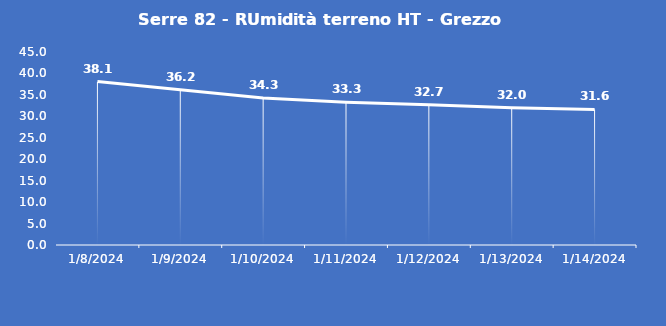
| Category | Serre 82 - RUmidità terreno HT - Grezzo (%VWC) |
|---|---|
| 1/8/24 | 38.1 |
| 1/9/24 | 36.2 |
| 1/10/24 | 34.3 |
| 1/11/24 | 33.3 |
| 1/12/24 | 32.7 |
| 1/13/24 | 32 |
| 1/14/24 | 31.6 |